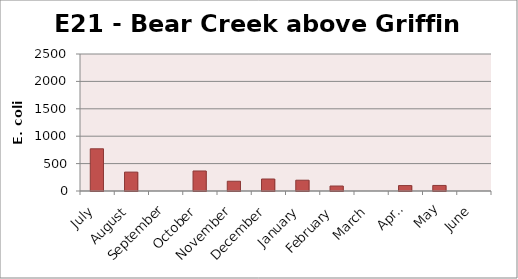
| Category | E. coli MPN |
|---|---|
| July | 770.1 |
| August | 344.8 |
| September | 0 |
| October | 365.4 |
| November | 178.2 |
| December | 218.7 |
| January | 196.8 |
| February | 90.7 |
| March | 0 |
| April | 99 |
| May | 101.4 |
| June | 0 |